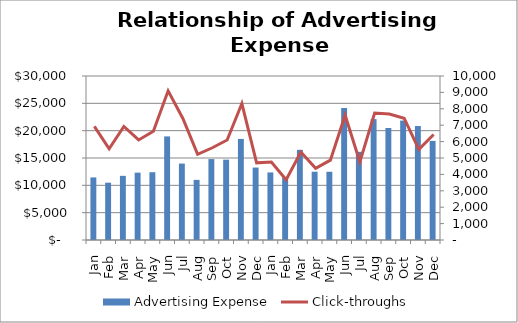
| Category | Advertising Expense |
|---|---|
| Jan | 11448 |
| Feb | 10486 |
| Mar | 11737 |
| Apr | 12322 |
| May | 12396 |
| Jun | 18947 |
| Jul | 13978 |
| Aug | 10998 |
| Sep | 14802 |
| Oct | 14695 |
| Nov | 18489 |
| Dec | 13251 |
| Jan | 12360 |
| Feb | 11489 |
| Mar | 16489 |
| Apr | 12489 |
| May | 12480 |
| Jun | 24155 |
| Jul | 16124 |
| Aug | 22108 |
| Sep | 20489 |
| Oct | 21844 |
| Nov | 20848 |
| Dec | 18127 |